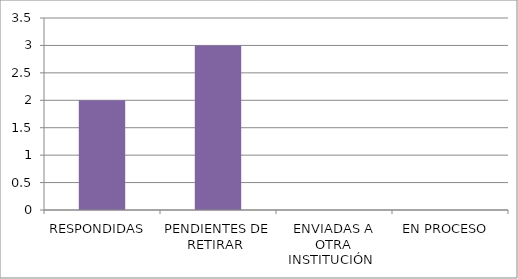
| Category | Series 0 |
|---|---|
| RESPONDIDAS  | 2 |
| PENDIENTES DE RETIRAR  | 3 |
| ENVIADAS A OTRA INSTITUCIÓN  | 0 |
| EN PROCESO  | 0 |